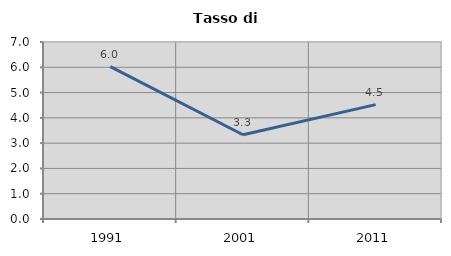
| Category | Tasso di disoccupazione   |
|---|---|
| 1991.0 | 6.025 |
| 2001.0 | 3.333 |
| 2011.0 | 4.523 |